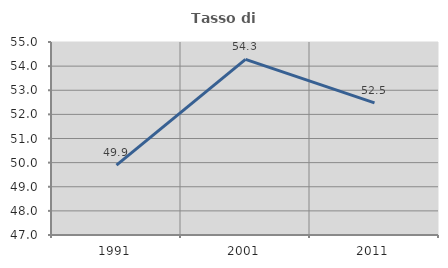
| Category | Tasso di occupazione   |
|---|---|
| 1991.0 | 49.895 |
| 2001.0 | 54.277 |
| 2011.0 | 52.475 |